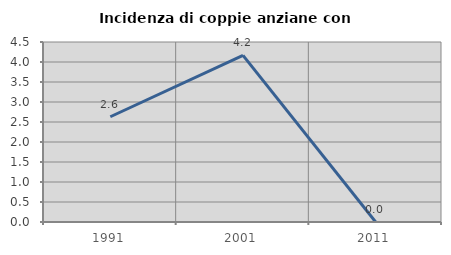
| Category | Incidenza di coppie anziane con figli |
|---|---|
| 1991.0 | 2.632 |
| 2001.0 | 4.167 |
| 2011.0 | 0 |